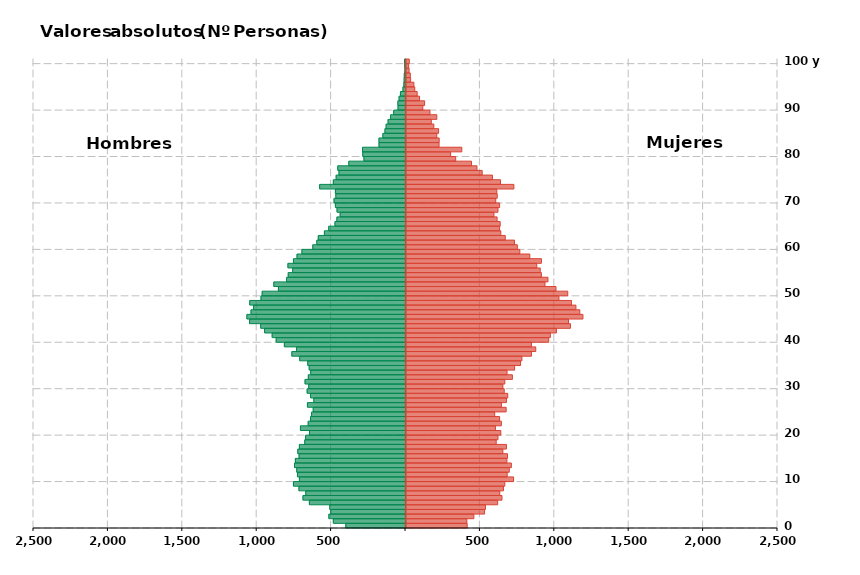
| Category | Hombres | Mujeres |
|---|---|---|
| 0 | -401 | 411 |
| 1 | -485 | 409 |
| 2 | -515 | 456 |
| 3 | -502 | 528 |
| 4 | -509 | 534 |
| 5 | -646 | 616 |
| 6 | -689 | 645 |
| 7 | -670 | 630 |
| 8 | -716 | 655 |
| 9 | -753 | 664 |
| 10 | -713 | 723 |
| 11 | -726 | 680 |
| 12 | -731 | 694 |
| 13 | -746 | 708 |
| 14 | -740 | 678 |
| 15 | -715 | 682 |
| 16 | -724 | 651 |
| 17 | -713 | 675 |
| 18 | -677 | 606 |
| 19 | -671 | 618 |
| 20 | -645 | 637 |
| 21 | -706 | 601 |
| 22 | -654 | 641 |
| 23 | -638 | 629 |
| 24 | -631 | 596 |
| 25 | -620 | 673 |
| 26 | -659 | 641 |
| 27 | -616 | 675 |
| 28 | -638 | 684 |
| 29 | -661 | 660 |
| 30 | -650 | 651 |
| 31 | -675 | 664 |
| 32 | -653 | 715 |
| 33 | -637 | 679 |
| 34 | -647 | 730 |
| 35 | -657 | 770 |
| 36 | -711 | 779 |
| 37 | -764 | 843 |
| 38 | -732 | 872 |
| 39 | -814 | 843 |
| 40 | -869 | 959 |
| 41 | -896 | 970 |
| 42 | -947 | 1011 |
| 43 | -973 | 1105 |
| 44 | -1048 | 1092 |
| 45 | -1066 | 1189 |
| 46 | -1038 | 1168 |
| 47 | -1021 | 1142 |
| 48 | -1047 | 1112 |
| 49 | -971 | 1028 |
| 50 | -963 | 1087 |
| 51 | -854 | 1008 |
| 52 | -885 | 934 |
| 53 | -799 | 954 |
| 54 | -788 | 910 |
| 55 | -758 | 902 |
| 56 | -790 | 879 |
| 57 | -753 | 910 |
| 58 | -729 | 832 |
| 59 | -696 | 765 |
| 60 | -623 | 748 |
| 61 | -596 | 729 |
| 62 | -586 | 667 |
| 63 | -545 | 637 |
| 64 | -516 | 629 |
| 65 | -474 | 633 |
| 66 | -461 | 612 |
| 67 | -439 | 591 |
| 68 | -460 | 618 |
| 69 | -471 | 629 |
| 70 | -480 | 603 |
| 71 | -468 | 613 |
| 72 | -471 | 610 |
| 73 | -577 | 725 |
| 74 | -485 | 635 |
| 75 | -466 | 581 |
| 76 | -447 | 512 |
| 77 | -455 | 477 |
| 78 | -381 | 440 |
| 79 | -279 | 334 |
| 80 | -287 | 300 |
| 81 | -289 | 375 |
| 82 | -178 | 222 |
| 83 | -178 | 223 |
| 84 | -152 | 207 |
| 85 | -138 | 219 |
| 86 | -130 | 187 |
| 87 | -117 | 170 |
| 88 | -100 | 207 |
| 89 | -79 | 161 |
| 90 | -50 | 113 |
| 91 | -51 | 125 |
| 92 | -43 | 91 |
| 93 | -34 | 75 |
| 94 | -17 | 59 |
| 95 | -11 | 53 |
| 96 | -9 | 31 |
| 97 | -8 | 29 |
| 98 | -4 | 21 |
| 99 | -5 | 18 |
| 100 | -6 | 22 |